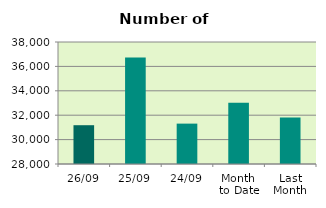
| Category | Series 0 |
|---|---|
| 26/09 | 31180 |
| 25/09 | 36722 |
| 24/09 | 31310 |
| Month 
to Date | 33012.842 |
| Last
Month | 31813.182 |